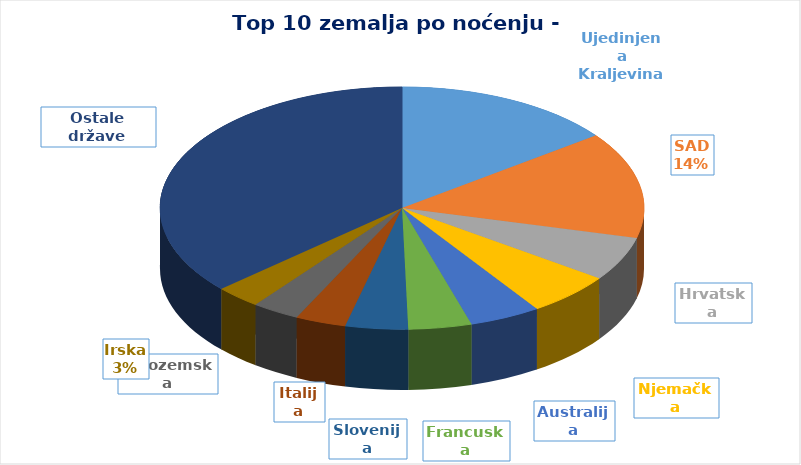
| Category | 2023.g. |
|---|---|
| Ujedinjena Kraljevina | 101382 |
| SAD | 97569 |
| Hrvatska | 40501 |
| Njemačka | 39526 |
| Australija | 32747 |
| Francuska | 28969 |
| Slovenija | 28708 |
| Italija | 23282 |
| Nizozemska | 21811 |
| Irska | 21040 |
| Ostale države | 251485 |